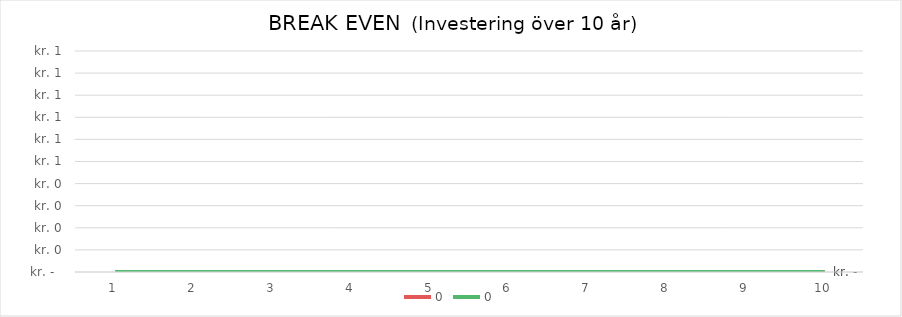
| Category | 0 | 19W Rax (on/off) | Løsning 2 |
|---|---|---|---|
| 0 | 0 |  |  |
| 1 | 0 |  |  |
| 2 | 0 |  |  |
| 3 | 0 |  |  |
| 4 | 0 |  |  |
| 5 | 0 |  |  |
| 6 | 0 |  |  |
| 7 | 0 |  |  |
| 8 | 0 |  |  |
| 9 | 0 |  |  |